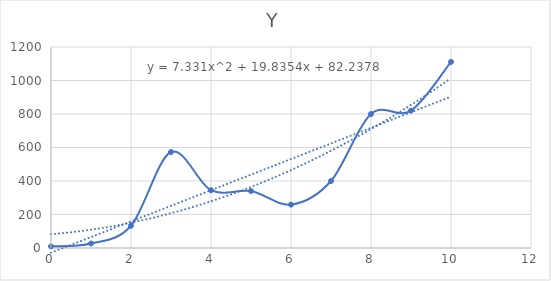
| Category | Y |
|---|---|
| 0.0 | 10 |
| 1.0 | 27 |
| 2.0 | 133 |
| 3.0 | 573 |
| 4.0 | 345 |
| 5.0 | 340 |
| 6.0 | 259 |
| 7.0 | 400 |
| 8.0 | 800 |
| 9.0 | 820 |
| 10.0 | 1111 |